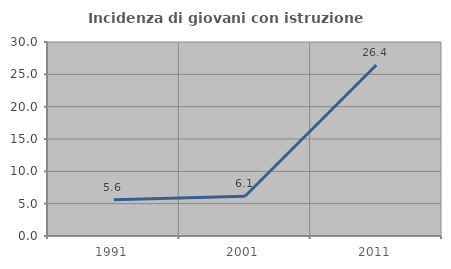
| Category | Incidenza di giovani con istruzione universitaria |
|---|---|
| 1991.0 | 5.607 |
| 2001.0 | 6.14 |
| 2011.0 | 26.437 |